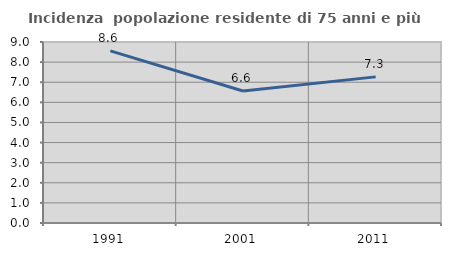
| Category | Incidenza  popolazione residente di 75 anni e più |
|---|---|
| 1991.0 | 8.56 |
| 2001.0 | 6.562 |
| 2011.0 | 7.266 |